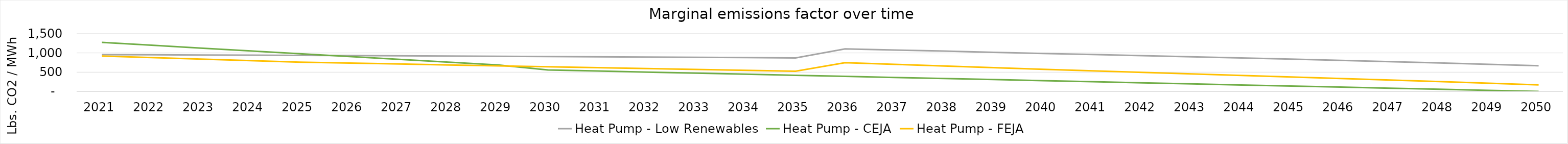
| Category | Heat Pump - Low Renewables | Heat Pump - CEJA | Heat Pump - FEJA |
|---|---|---|---|
| 2021.0 | 955.796 | 1273.311 | 919.8 |
| 2022.0 | 951.405 | 1199.923 | 879.611 |
| 2023.0 | 946.805 | 1126.535 | 839.421 |
| 2024.0 | 941.981 | 1053.147 | 799.232 |
| 2025.0 | 936.921 | 979.759 | 759.042 |
| 2026.0 | 931.608 | 906.371 | 735.507 |
| 2027.0 | 926.026 | 832.983 | 711.972 |
| 2028.0 | 920.159 | 759.595 | 688.436 |
| 2029.0 | 913.987 | 686.207 | 664.901 |
| 2030.0 | 907.493 | 558.474 | 641.366 |
| 2031.0 | 900.654 | 530.55 | 617.831 |
| 2032.0 | 893.45 | 502.626 | 594.295 |
| 2033.0 | 885.856 | 474.703 | 570.76 |
| 2034.0 | 877.849 | 446.779 | 547.225 |
| 2035.0 | 869.4 | 418.855 | 523.689 |
| 2036.0 | 1106.001 | 390.932 | 745.672 |
| 2037.0 | 1076.864 | 363.008 | 702.415 |
| 2038.0 | 1047.196 | 335.084 | 659.157 |
| 2039.0 | 1016.964 | 307.161 | 615.9 |
| 2040.0 | 986.132 | 279.237 | 572.643 |
| 2041.0 | 958.166 | 251.313 | 532.89 |
| 2042.0 | 929.52 | 223.39 | 493.137 |
| 2043.0 | 900.152 | 195.466 | 453.385 |
| 2044.0 | 870.015 | 167.542 | 413.632 |
| 2045.0 | 839.061 | 139.618 | 373.88 |
| 2046.0 | 807.236 | 111.695 | 334.127 |
| 2047.0 | 774.486 | 83.771 | 294.374 |
| 2048.0 | 740.751 | 55.847 | 254.622 |
| 2049.0 | 703.74 | 27.924 | 212.641 |
| 2050.0 | 665.616 | 0 | 170.66 |